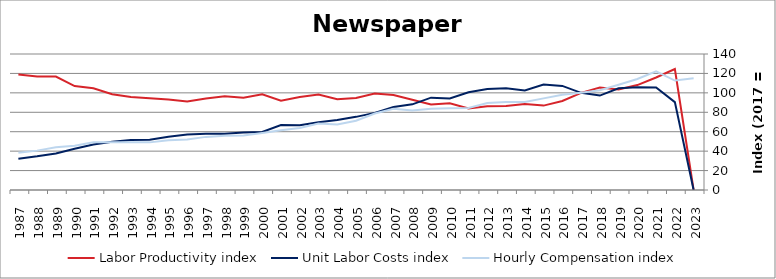
| Category | Labor Productivity index | Unit Labor Costs index | Hourly Compensation index |
|---|---|---|---|
| 2023.0 | 0 | 0 | 114.952 |
| 2022.0 | 124.574 | 90.441 | 112.666 |
| 2021.0 | 115.774 | 105.483 | 122.121 |
| 2020.0 | 107.997 | 105.8 | 114.261 |
| 2019.0 | 103.425 | 104.796 | 108.385 |
| 2018.0 | 105.587 | 97.193 | 102.624 |
| 2017.0 | 100 | 100 | 100 |
| 2016.0 | 91.575 | 107.128 | 98.103 |
| 2015.0 | 86.868 | 108.594 | 94.333 |
| 2014.0 | 88.431 | 102.515 | 90.655 |
| 2013.0 | 86.372 | 104.754 | 90.478 |
| 2012.0 | 86.093 | 103.919 | 89.467 |
| 2011.0 | 83.94 | 100.616 | 84.457 |
| 2010.0 | 89.365 | 94.255 | 84.231 |
| 2009.0 | 87.939 | 95.066 | 83.6 |
| 2008.0 | 92.824 | 88.165 | 81.838 |
| 2007.0 | 97.786 | 85.433 | 83.541 |
| 2006.0 | 99.234 | 79.394 | 78.786 |
| 2005.0 | 94.772 | 75.294 | 71.357 |
| 2004.0 | 93.354 | 72.161 | 67.365 |
| 2003.0 | 98.182 | 69.731 | 68.463 |
| 2002.0 | 95.706 | 66.737 | 63.872 |
| 2001.0 | 92.007 | 66.89 | 61.543 |
| 2000.0 | 98.568 | 59.643 | 58.789 |
| 1999.0 | 94.866 | 59.149 | 56.112 |
| 1998.0 | 96.443 | 57.987 | 55.925 |
| 1997.0 | 94.276 | 57.997 | 54.678 |
| 1996.0 | 91.027 | 57.121 | 51.996 |
| 1995.0 | 93.098 | 54.914 | 51.124 |
| 1994.0 | 94.567 | 51.847 | 49.03 |
| 1993.0 | 95.698 | 51.458 | 49.244 |
| 1992.0 | 98.668 | 49.742 | 49.08 |
| 1991.0 | 104.733 | 46.817 | 49.032 |
| 1990.0 | 107.018 | 42.472 | 45.453 |
| 1989.0 | 116.723 | 37.622 | 43.913 |
| 1988.0 | 116.739 | 34.725 | 40.538 |
| 1987.0 | 118.79 | 32.289 | 38.356 |